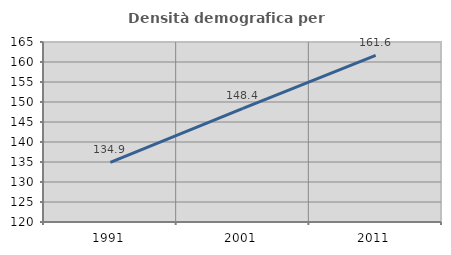
| Category | Densità demografica |
|---|---|
| 1991.0 | 134.906 |
| 2001.0 | 148.429 |
| 2011.0 | 161.635 |